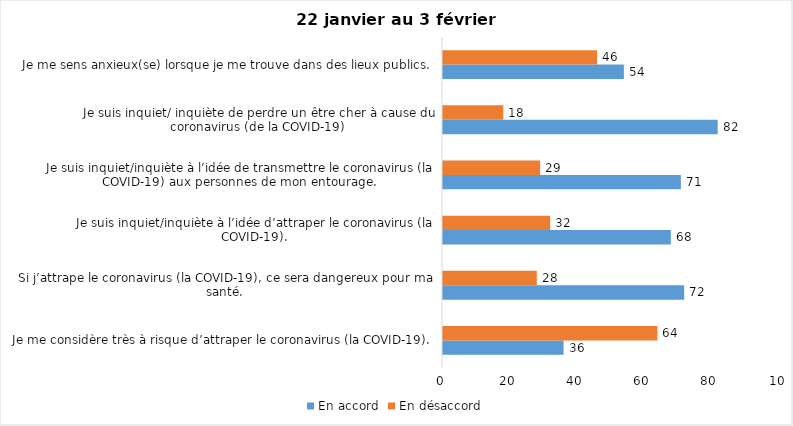
| Category | En accord | En désaccord |
|---|---|---|
| Je me considère très à risque d’attraper le coronavirus (la COVID-19). | 36 | 64 |
| Si j’attrape le coronavirus (la COVID-19), ce sera dangereux pour ma santé. | 72 | 28 |
| Je suis inquiet/inquiète à l’idée d’attraper le coronavirus (la COVID-19). | 68 | 32 |
| Je suis inquiet/inquiète à l’idée de transmettre le coronavirus (la COVID-19) aux personnes de mon entourage. | 71 | 29 |
| Je suis inquiet/ inquiète de perdre un être cher à cause du coronavirus (de la COVID-19) | 82 | 18 |
| Je me sens anxieux(se) lorsque je me trouve dans des lieux publics. | 54 | 46 |